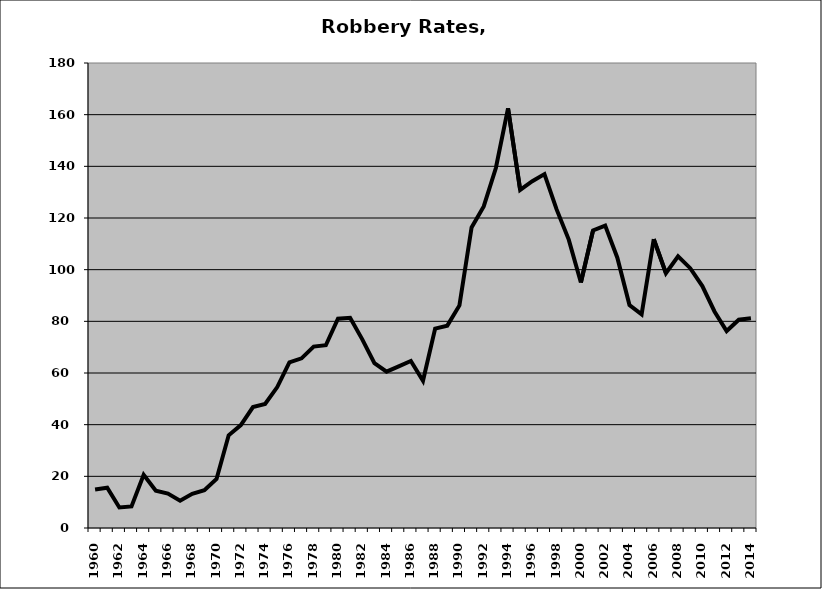
| Category | Robbery |
|---|---|
| 1960.0 | 14.875 |
| 1961.0 | 15.576 |
| 1962.0 | 7.963 |
| 1963.0 | 8.341 |
| 1964.0 | 20.57 |
| 1965.0 | 14.39 |
| 1966.0 | 13.322 |
| 1967.0 | 10.562 |
| 1968.0 | 13.237 |
| 1969.0 | 14.6 |
| 1970.0 | 18.99 |
| 1971.0 | 35.894 |
| 1972.0 | 39.859 |
| 1973.0 | 46.822 |
| 1974.0 | 48.021 |
| 1975.0 | 54.561 |
| 1976.0 | 64.104 |
| 1977.0 | 65.676 |
| 1978.0 | 70.216 |
| 1979.0 | 70.74 |
| 1980.0 | 81.028 |
| 1981.0 | 81.383 |
| 1982.0 | 73.03 |
| 1983.0 | 63.78 |
| 1984.0 | 60.508 |
| 1985.0 | 62.572 |
| 1986.0 | 64.648 |
| 1987.0 | 56.99 |
| 1988.0 | 77.198 |
| 1989.0 | 78.329 |
| 1990.0 | 86.157 |
| 1991.0 | 116.319 |
| 1992.0 | 124.484 |
| 1993.0 | 139.349 |
| 1994.0 | 162.458 |
| 1995.0 | 130.886 |
| 1996.0 | 134.242 |
| 1997.0 | 136.983 |
| 1998.0 | 123.328 |
| 1999.0 | 111.644 |
| 2000.0 | 95.02 |
| 2001.0 | 115.186 |
| 2002.0 | 117.067 |
| 2003.0 | 104.628 |
| 2004.0 | 86.287 |
| 2005.0 | 82.689 |
| 2006.0 | 111.801 |
| 2007.0 | 98.637 |
| 2008.0 | 105.162 |
| 2009.0 | 100.576 |
| 2010.0 | 93.654 |
| 2011.0 | 83.83 |
| 2012.0 | 76.244 |
| 2013.0 | 80.643 |
| 2014.0 | 81.16 |